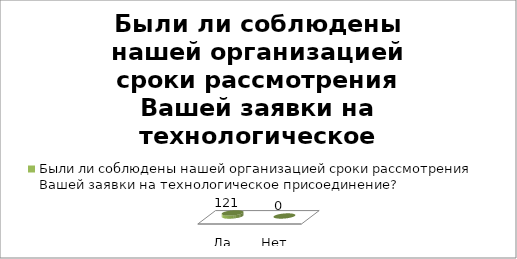
| Category | Были ли соблюдены нашей организацией сроки рассмотрения Вашей заявки на технологическое присоединение? |
|---|---|
| Да | 121 |
| Нет | 0 |